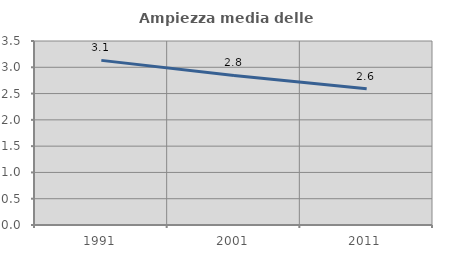
| Category | Ampiezza media delle famiglie |
|---|---|
| 1991.0 | 3.131 |
| 2001.0 | 2.845 |
| 2011.0 | 2.593 |